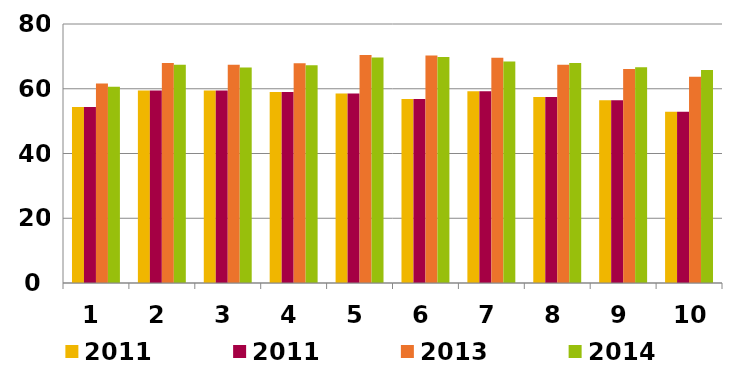
| Category | 2011 | 2013 | 2014 |
|---|---|---|---|
| 1.0 | 54.363 | 61.604 | 60.616 |
| 2.0 | 59.432 | 67.977 | 67.382 |
| 3.0 | 59.457 | 67.379 | 66.587 |
| 4.0 | 59.016 | 67.84 | 67.244 |
| 5.0 | 58.531 | 70.417 | 69.656 |
| 6.0 | 56.85 | 70.302 | 69.769 |
| 7.0 | 59.259 | 69.612 | 68.422 |
| 8.0 | 57.45 | 67.451 | 67.972 |
| 9.0 | 56.464 | 66.095 | 66.608 |
| 10.0 | 52.915 | 63.671 | 65.759 |